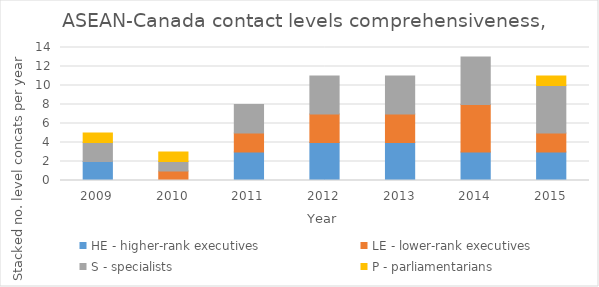
| Category | HE - higher-rank executives | LE - lower-rank executives | S - specialists | P - parliamentarians |
|---|---|---|---|---|
| 2009.0 | 2 | 0 | 2 | 1 |
| 2010.0 | 0 | 1 | 1 | 1 |
| 2011.0 | 3 | 2 | 3 | 0 |
| 2012.0 | 4 | 3 | 4 | 0 |
| 2013.0 | 4 | 3 | 4 | 0 |
| 2014.0 | 3 | 5 | 5 | 0 |
| 2015.0 | 3 | 2 | 5 | 1 |